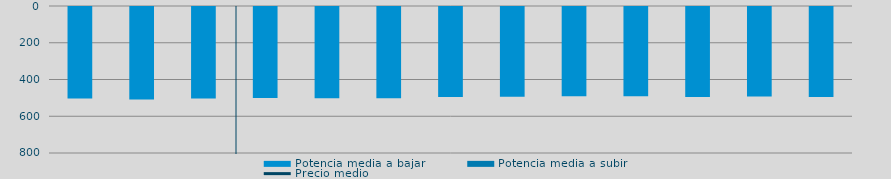
| Category | Potencia media a bajar | Potencia media a subir |
|---|---|---|
| 0 | 498.529 |  |
| 1 | 503.264 |  |
| 2 | 498.488 |  |
| 3 | 495.172 |  |
| 4 | 496.264 |  |
| 5 | 496.176 |  |
| 6 | 490.249 |  |
| 7 | 488.138 |  |
| 8 | 485.047 |  |
| 9 | 485.731 |  |
| 10 | 489.157 |  |
| 11 | 487.01 |  |
| 12 | 490.333 |  |